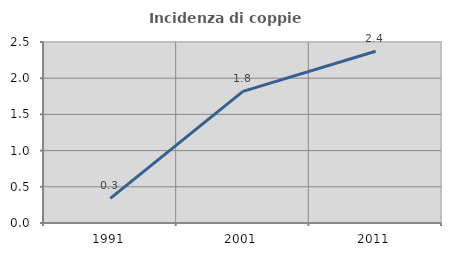
| Category | Incidenza di coppie miste |
|---|---|
| 1991.0 | 0.34 |
| 2001.0 | 1.819 |
| 2011.0 | 2.373 |